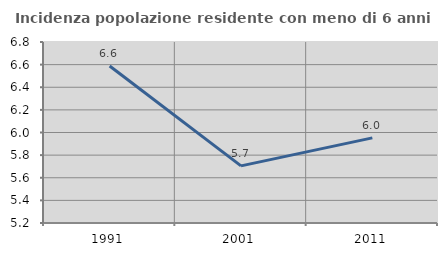
| Category | Incidenza popolazione residente con meno di 6 anni |
|---|---|
| 1991.0 | 6.588 |
| 2001.0 | 5.705 |
| 2011.0 | 5.952 |